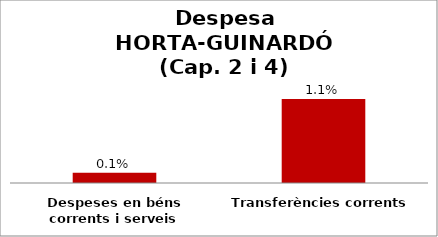
| Category | Series 0 |
|---|---|
| Despeses en béns corrents i serveis | 0.001 |
| Transferències corrents | 0.011 |